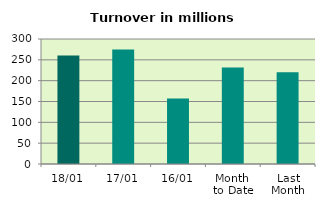
| Category | Series 0 |
|---|---|
| 18/01 | 260.594 |
| 17/01 | 274.754 |
| 16/01 | 157.085 |
| Month 
to Date | 231.526 |
| Last
Month | 219.947 |